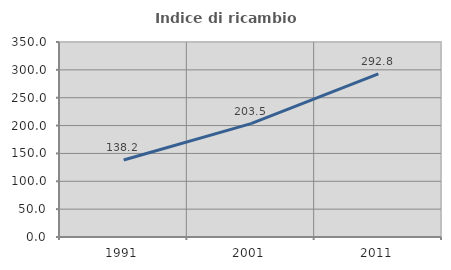
| Category | Indice di ricambio occupazionale  |
|---|---|
| 1991.0 | 138.235 |
| 2001.0 | 203.462 |
| 2011.0 | 292.825 |